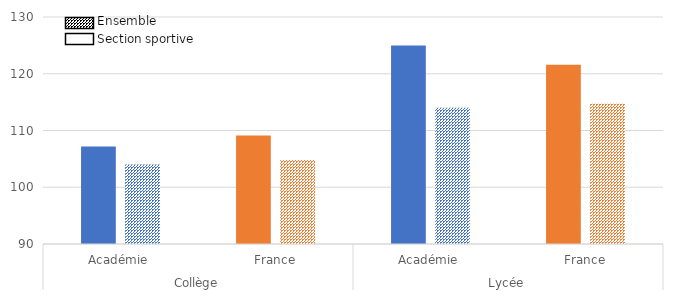
| Category | section sportive | ensemble |
|---|---|---|
| 0 | 107.2 | 104 |
| 1 | 109.1 | 104.8 |
| 2 | 125 | 114 |
| 3 | 121.6 | 114.7 |